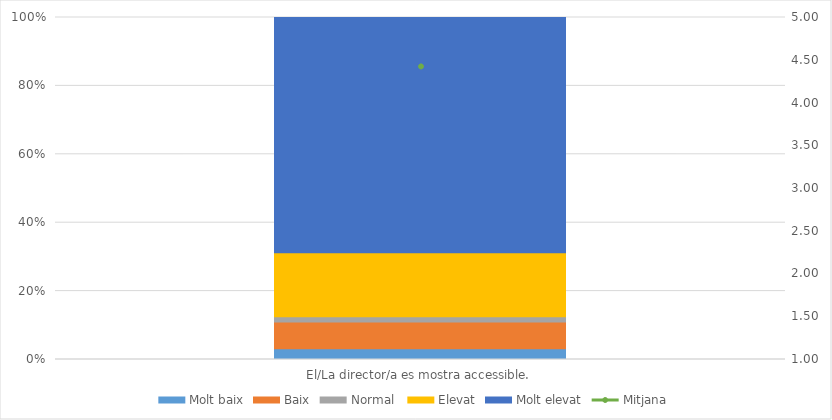
| Category | Molt baix | Baix | Normal  | Elevat | Molt elevat |
|---|---|---|---|---|---|
| El/La director/a es mostra accessible. | 2 | 5 | 1 | 12 | 44 |